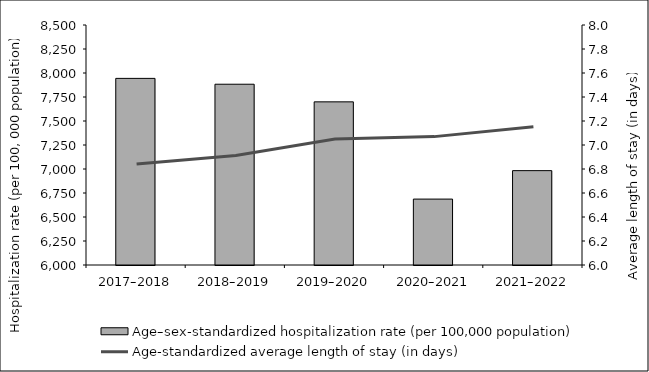
| Category | Age–sex-standardized hospitalization rate (per 100,000 population) |
|---|---|
| 2017–2018 | 7943.875 |
| 2018–2019 | 7883.11 |
| 2019–2020 | 7699.481 |
| 2020–2021 | 6686.675 |
| 2021–2022 | 6982.958 |